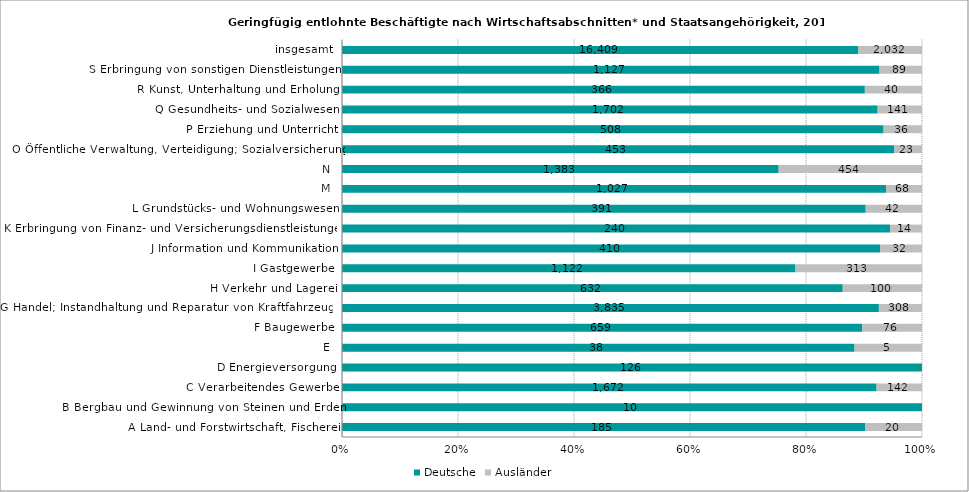
| Category | Deutsche | Ausländer |
|---|---|---|
| A Land- und Forstwirtschaft, Fischerei | 185 | 20 |
| B Bergbau und Gewinnung von Steinen und Erden | 10 | 0 |
| C Verarbeitendes Gewerbe | 1672 | 142 |
| D Energieversorgung | 126 | 0 |
| E | 38 | 5 |
| F Baugewerbe | 659 | 76 |
| G Handel; Instandhaltung und Reparatur von Kraftfahrzeugen | 3835 | 308 |
| H Verkehr und Lagerei | 632 | 100 |
| I Gastgewerbe | 1122 | 313 |
| J Information und Kommunikation | 410 | 32 |
| K Erbringung von Finanz- und Versicherungsdienstleistungen | 240 | 14 |
| L Grundstücks- und Wohnungswesen | 391 | 42 |
| M | 1027 | 68 |
| N | 1383 | 454 |
| O Öffentliche Verwaltung, Verteidigung; Sozialversicherung | 453 | 23 |
| P Erziehung und Unterricht | 508 | 36 |
| Q Gesundheits- und Sozialwesen | 1702 | 141 |
| R Kunst, Unterhaltung und Erholung | 366 | 40 |
| S Erbringung von sonstigen Dienstleistungen | 1127 | 89 |
| insgesamt | 16409 | 2032 |